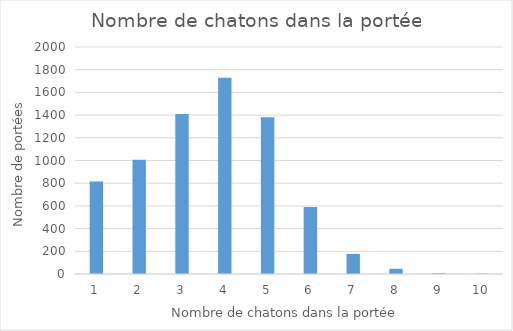
| Category | Series 0 |
|---|---|
| 1.0 | 815 |
| 2.0 | 1007 |
| 3.0 | 1409 |
| 4.0 | 1730 |
| 5.0 | 1380 |
| 6.0 | 591 |
| 7.0 | 177 |
| 8.0 | 46 |
| 9.0 | 7 |
| 10.0 | 3 |